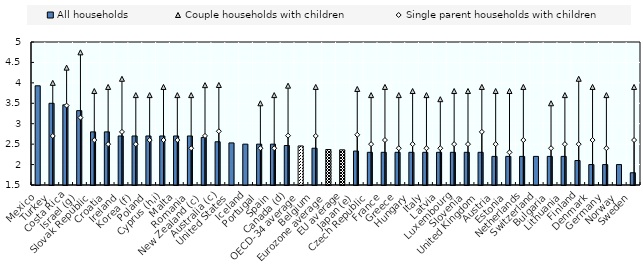
| Category | All households |
|---|---|
| Mexico | 3.928 |
| Turkey | 3.5 |
| Costa Rica | 3.463 |
| Israel (g) | 3.32 |
| Slovak Republic | 2.8 |
| Croatia | 2.8 |
| Ireland | 2.7 |
| Korea (f) | 2.7 |
| Poland | 2.7 |
| Cyprus (h,i) | 2.7 |
| Malta | 2.7 |
| Romania | 2.7 |
| New Zealand (c) | 2.663 |
| Australia (c) | 2.558 |
| United States | 2.53 |
| Iceland | 2.5 |
| Portugal | 2.5 |
| Spain | 2.5 |
| Canada (d) | 2.467 |
| OECD-34 average | 2.456 |
| Belgium | 2.4 |
| Eurozone average | 2.368 |
| EU average | 2.361 |
| Japan (e) | 2.331 |
| Czech Republic | 2.3 |
| France | 2.3 |
| Greece | 2.3 |
| Hungary | 2.3 |
| Italy | 2.3 |
| Latvia | 2.3 |
| Luxembourg | 2.3 |
| Slovenia | 2.3 |
| United Kingdom | 2.3 |
| Austria | 2.2 |
| Estonia | 2.2 |
| Netherlands | 2.2 |
| Switzerland | 2.2 |
| Bulgaria | 2.2 |
| Lithuania | 2.2 |
| Finland | 2.1 |
| Denmark | 2 |
| Germany | 2 |
| Norway | 2 |
| Sweden | 1.8 |